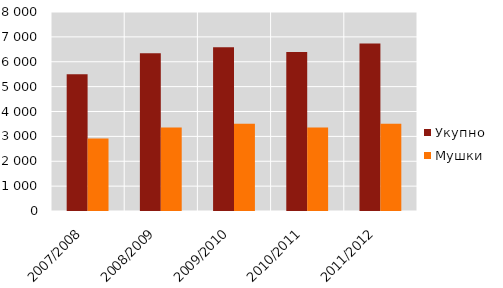
| Category | Укупно | Мушки |
|---|---|---|
| 2007/2008 | 5502 | 2916 |
| 2008/2009 | 6342 | 3360 |
| 2009/2010 | 6583 | 3504 |
| 2010/2011 | 6394 | 3358 |
| 2011/2012 | 6732 | 3505 |